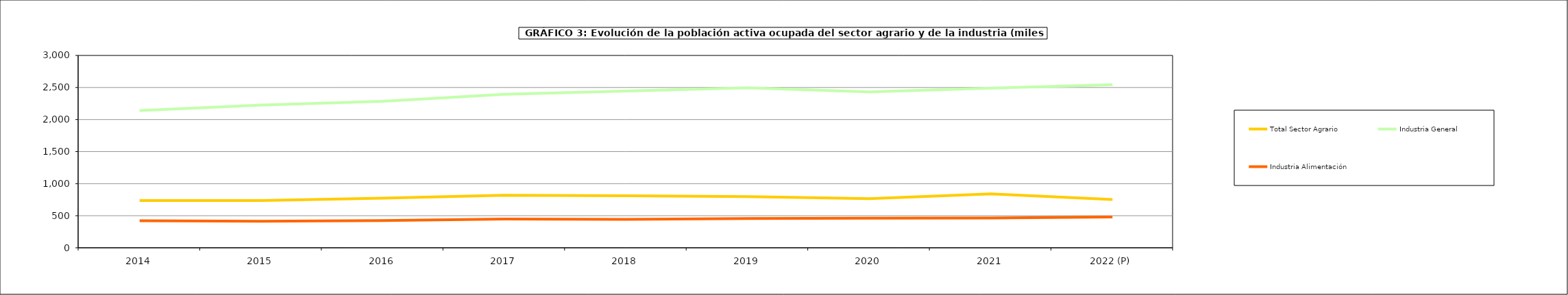
| Category | Total Sector Agrario | Industria General | Industria Alimentación |
|---|---|---|---|
| 2014 | 735.85 | 2141.4 | 420.65 |
| 2015 | 736.75 | 2225.025 | 414.025 |
| 2016 | 774.5 | 2284.2 | 423.7 |
| 2017 | 819.5 | 2393.4 | 448 |
| 2018 | 812.575 | 2444.2 | 442.4 |
| 2019 | 797.275 | 2494.925 | 456.05 |
| 2020 | 765.35 | 2431.225 | 460.475 |
| 2021 | 840.1 | 2489.3 | 464.1 |
| 2022 (P) | 753.2 | 2544.6 | 480.7 |